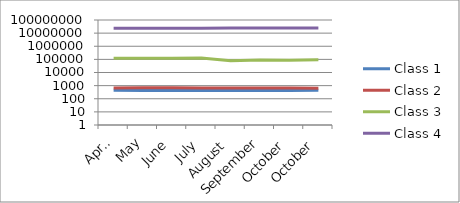
| Category | Class 1 | Class 2 | Class 3 | Class 4 |
|---|---|---|---|---|
| April | 449 | 663 | 119857 | 23975239 |
| May | 420 | 686 | 121241 | 23988139 |
| June | 422 | 687 | 123483 | 24005430 |
| July | 427 | 658 | 125491 | 24038014 |
| August | 427 | 655 | 78827 | 24101362 |
| September | 429 | 650 | 88860 | 24110132 |
| October | 433 | 645 | 87615 | 24128941 |
| October | 437 | 636 | 95286 | 24146202 |